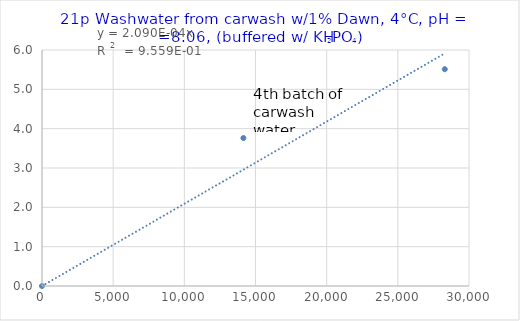
| Category | Series 0 |
|---|---|
| 0.0 | 0 |
| 14149.076517150397 | 3.762 |
| 28298.153034300794 | 5.512 |